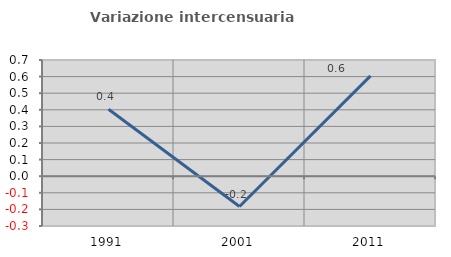
| Category | Variazione intercensuaria annua |
|---|---|
| 1991.0 | 0.404 |
| 2001.0 | -0.183 |
| 2011.0 | 0.605 |